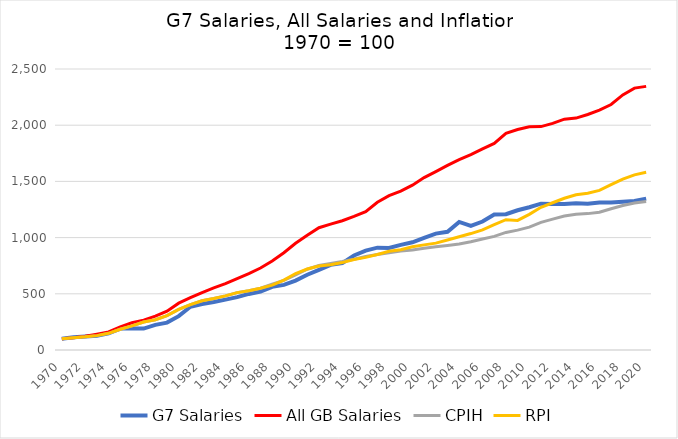
| Category | G7 Salaries | All GB Salaries | CPIH | RPI |
|---|---|---|---|---|
| 1970.0 | 100 | 100 | 100 | 100 |
| 1971.0 | 112.763 | 109.559 | 109.439 | 109.439 |
| 1972.0 | 120.656 | 122.794 | 117.237 | 117.237 |
| 1973.0 | 125.782 | 141.176 | 127.907 | 127.907 |
| 1974.0 | 148.001 | 161.029 | 148.427 | 148.427 |
| 1975.0 | 190.928 | 205.515 | 184.405 | 184.405 |
| 1976.0 | 190.928 | 241.912 | 214.911 | 214.911 |
| 1977.0 | 190.928 | 265.809 | 248.974 | 248.974 |
| 1978.0 | 223.706 | 301.471 | 269.631 | 269.631 |
| 1979.0 | 243.849 | 345.221 | 305.746 | 305.746 |
| 1980.0 | 301.128 | 416.544 | 360.739 | 360.739 |
| 1981.0 | 384.675 | 465.074 | 403.557 | 403.557 |
| 1982.0 | 408.713 | 511.397 | 438.304 | 438.304 |
| 1983.0 | 426.858 | 552.574 | 458.413 | 458.413 |
| 1984.0 | 448.206 | 590.441 | 481.259 | 481.259 |
| 1985.0 | 470.605 | 635.294 | 510.534 | 510.534 |
| 1986.0 | 498.847 | 680.515 | 527.907 | 527.907 |
| 1987.0 | 520.169 | 729.412 | 549.932 | 549.932 |
| 1988.0 | 562.173 | 792.279 | 584.833 | 576.881 |
| 1989.0 | 579.344 | 865.809 | 618.807 | 621.751 |
| 1990.0 | 616.991 | 949.265 | 668.554 | 680.575 |
| 1991.0 | 669.426 | 1020.221 | 718.301 | 720.52 |
| 1992.0 | 712.942 | 1087.868 | 751.062 | 747.469 |
| 1993.0 | 757.509 | 1119.853 | 770.475 | 759.371 |
| 1994.0 | 772.681 | 1150 | 787.462 | 777.702 |
| 1995.0 | 840.595 | 1188.235 | 808.089 | 804.651 |
| 1996.0 | 883.906 | 1231.25 | 831.143 | 824.077 |
| 1997.0 | 910.302 | 1314.706 | 849.343 | 849.932 |
| 1998.0 | 908.408 | 1373.529 | 865.116 | 879.07 |
| 1999.0 | 935.362 | 1412.868 | 880.89 | 892.613 |
| 2000.0 | 958.334 | 1466.544 | 890.597 | 919.015 |
| 2001.0 | 997.386 | 1533.824 | 905.157 | 935.294 |
| 2002.0 | 1035.241 | 1587.5 | 918.504 | 950.889 |
| 2003.0 | 1051.675 | 1641.912 | 930.637 | 978.386 |
| 2004.0 | 1139.716 | 1693.75 | 943.984 | 1007.524 |
| 2005.0 | 1104.499 | 1738.603 | 963.397 | 1035.978 |
| 2006.0 | 1143.237 | 1789.338 | 987.664 | 1069.083 |
| 2007.0 | 1204.866 | 1838.235 | 1010.718 | 1114.911 |
| 2008.0 | 1208.22 | 1927.206 | 1045.905 | 1159.371 |
| 2009.0 | 1242.959 | 1962.132 | 1066.532 | 1153.215 |
| 2010.0 | 1270.272 | 1986.765 | 1093.225 | 1206.43 |
| 2011.0 | 1301.897 | 1987.5 | 1135.693 | 1269.22 |
| 2012.0 | 1299.98 | 2015.809 | 1164.813 | 1309.986 |
| 2013.0 | 1299.501 | 2053.676 | 1191.507 | 1349.795 |
| 2014.0 | 1306.449 | 2063.235 | 1208.493 | 1381.669 |
| 2015.0 | 1301.178 | 2095.588 | 1213.347 | 1395.349 |
| 2016.0 | 1311.72 | 2133.824 | 1225.48 | 1419.562 |
| 2017.0 | 1311.72 | 2184.191 | 1257.027 | 1470.451 |
| 2018.0 | 1317.949 | 2269.475 | 1286.148 | 1519.562 |
| 2019.0 | 1325.855 | 2329.756 | 1307.988 | 1558.55 |
| 2020.0 | 1346.976 | 2345.323 | 1321.335 | 1581.943 |